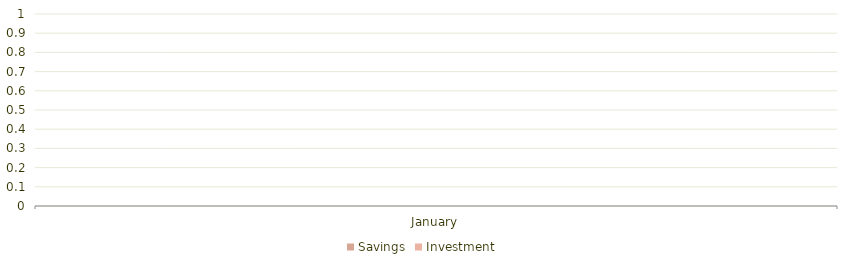
| Category | Savings | Investment |
|---|---|---|
| January | 0 | 0 |